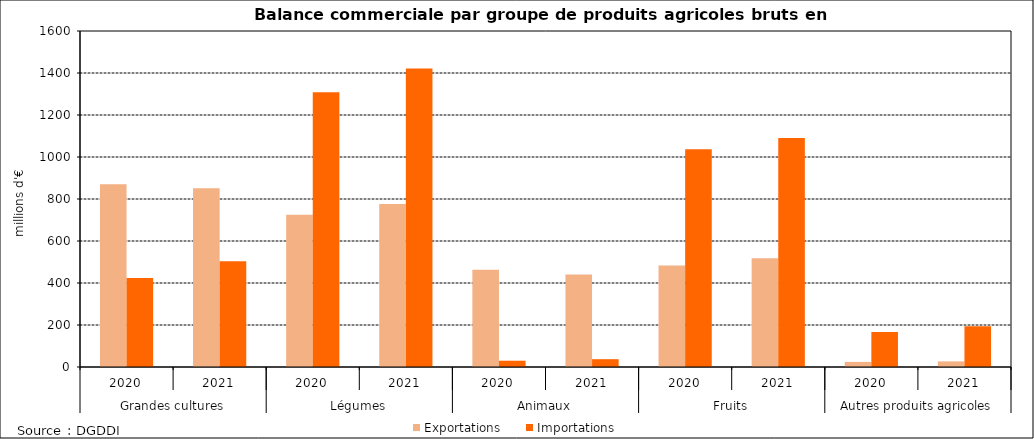
| Category | Exportations | Importations |
|---|---|---|
| 0 | 870.233 | 423.617 |
| 1 | 850.957 | 504.061 |
| 2 | 725.516 | 1308.29 |
| 3 | 776.068 | 1420.969 |
| 4 | 463.651 | 29.973 |
| 5 | 440.788 | 37.224 |
| 6 | 483.903 | 1037.137 |
| 7 | 518.424 | 1090.632 |
| 8 | 24.185 | 166.643 |
| 9 | 26.603 | 194.314 |